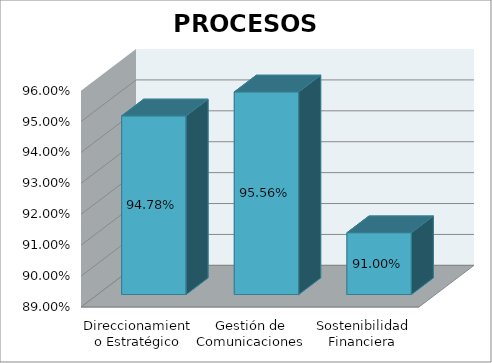
| Category | Series 0 |
|---|---|
| Direccionamiento Estratégico | 0.948 |
| Gestión de Comunicaciones | 0.956 |
| Sostenibilidad Financiera | 0.91 |